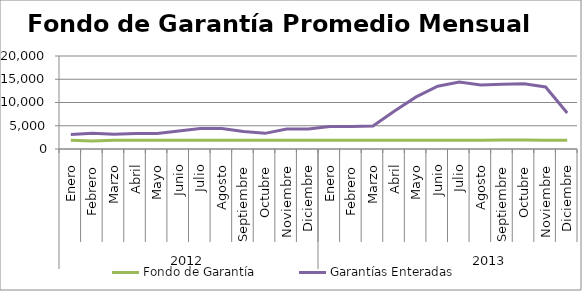
| Category | Fondo de Garantía | Garantías Enteradas |
|---|---|---|
| 0 | 1896.798 | 3141.641 |
| 1 | 1714.423 | 3362.648 |
| 2 | 1900.513 | 3154.118 |
| 3 | 1900.513 | 3348.058 |
| 4 | 1898.685 | 3308.859 |
| 5 | 1900.513 | 3850.375 |
| 6 | 1900.513 | 4400.539 |
| 7 | 1895.388 | 4383.327 |
| 8 | 1900.513 | 3757.632 |
| 9 | 1900.513 | 3362.932 |
| 10 | 1900.311 | 4285.609 |
| 11 | 1890.98 | 4296.87 |
| 12 | 1898.667 | 4842.786 |
| 13 | 1900.512 | 4845.136 |
| 14 | 1900.513 | 4938.365 |
| 15 | 1900.513 | 8179.666 |
| 16 | 1900.513 | 11202.213 |
| 17 | 1900.513 | 13493.433 |
| 18 | 1900.513 | 14387.844 |
| 19 | 1900.496 | 13769.803 |
| 20 | 1951.853 | 13899.147 |
| 21 | 1948.554 | 14005.922 |
| 22 | 1900.511 | 13346.59 |
| 23 | 1900.513 | 7751.204 |